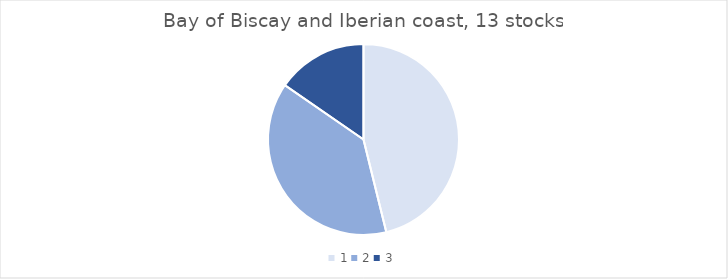
| Category | BoBiscay & Iberia |
|---|---|
| 0 | 6 |
| 1 | 5 |
| 2 | 2 |